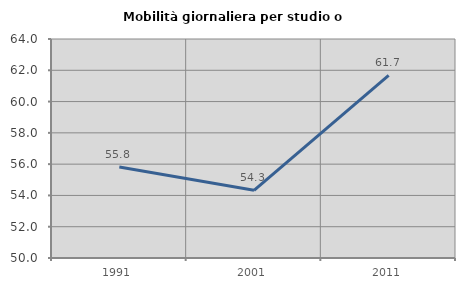
| Category | Mobilità giornaliera per studio o lavoro |
|---|---|
| 1991.0 | 55.816 |
| 2001.0 | 54.33 |
| 2011.0 | 61.678 |